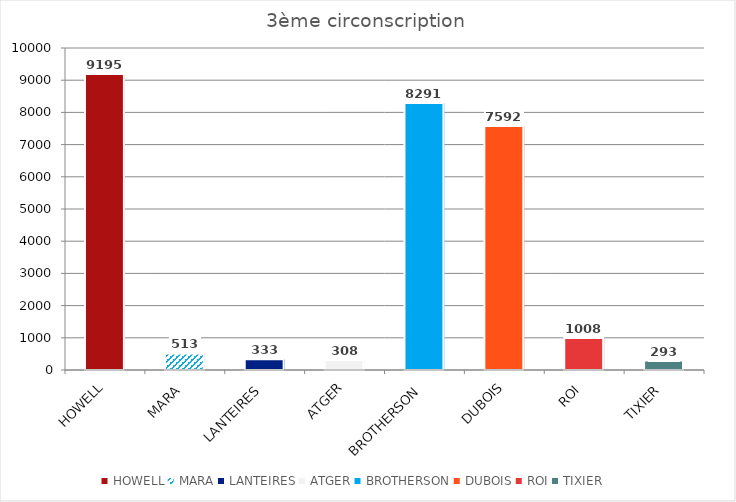
| Category | Series 0 |
|---|---|
| HOWELL | 9195 |
| MARA | 513 |
| LANTEIRES | 333 |
| ATGER | 308 |
| BROTHERSON | 8291 |
| DUBOIS | 7592 |
| ROI | 1008 |
| TIXIER | 293 |